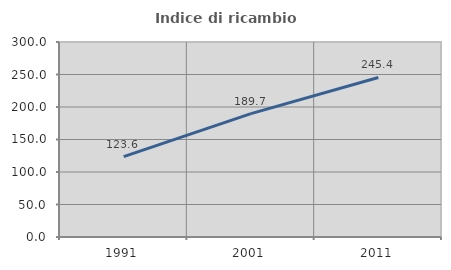
| Category | Indice di ricambio occupazionale  |
|---|---|
| 1991.0 | 123.551 |
| 2001.0 | 189.746 |
| 2011.0 | 245.412 |